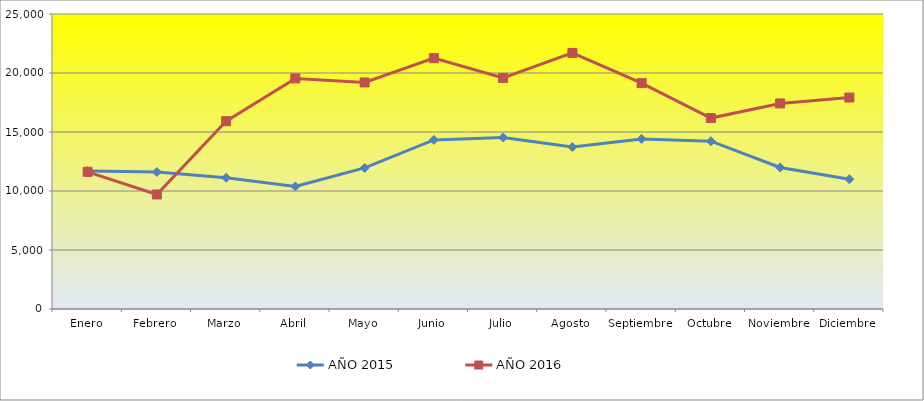
| Category | AÑO 2015 | AÑO 2016 |
|---|---|---|
| Enero | 11698 | 11627 |
| Febrero | 11610 | 9705 |
| Marzo | 11120 | 15915 |
| Abril | 10388 | 19540 |
| Mayo | 11958 | 19200 |
| Junio | 14332 | 21260 |
| Julio | 14531 | 19580 |
| Agosto | 13725 | 21700 |
| Septiembre | 14415 | 19140 |
| Octubre | 14221 | 16180 |
| Noviembre | 11992 | 17420 |
| Diciembre | 11000 | 17920 |